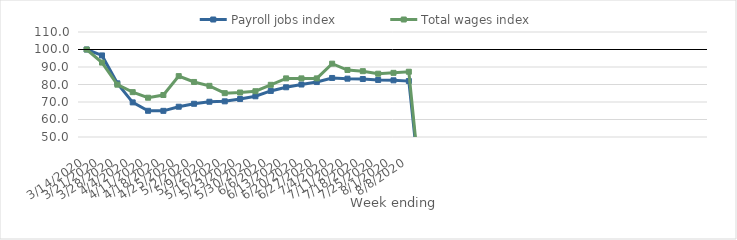
| Category | Payroll jobs index | Total wages index |
|---|---|---|
| 14/03/2020 | 100 | 100 |
| 21/03/2020 | 96.607 | 92.525 |
| 28/03/2020 | 80.662 | 79.9 |
| 04/04/2020 | 69.779 | 75.636 |
| 11/04/2020 | 64.974 | 72.452 |
| 18/04/2020 | 64.945 | 73.998 |
| 25/04/2020 | 67.292 | 84.794 |
| 02/05/2020 | 68.981 | 81.449 |
| 09/05/2020 | 70.146 | 79.232 |
| 16/05/2020 | 70.38 | 75.062 |
| 23/05/2020 | 71.69 | 75.402 |
| 30/05/2020 | 73.27 | 76.163 |
| 06/06/2020 | 76.329 | 79.813 |
| 13/06/2020 | 78.411 | 83.497 |
| 20/06/2020 | 79.989 | 83.498 |
| 27/06/2020 | 81.396 | 83.496 |
| 04/07/2020 | 83.74 | 91.91 |
| 11/07/2020 | 83.332 | 88.279 |
| 18/07/2020 | 83.133 | 87.613 |
| 25/07/2020 | 82.59 | 86.162 |
| 01/08/2020 | 82.392 | 86.659 |
| 08/08/2020 | 81.964 | 87.289 |